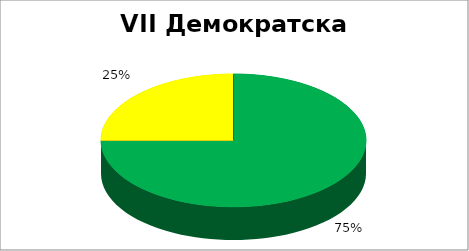
| Category | VII Демократска партиципација |
|---|---|
| 0 | 0.75 |
| 1 | 0 |
| 2 | 0.25 |
| 3 | 0 |
| 4 | 0 |